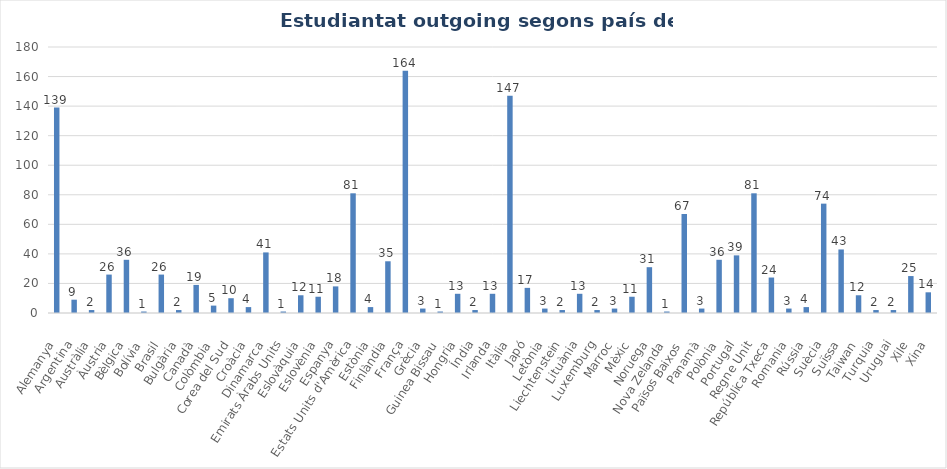
| Category | Total |
|---|---|
| Alemanya | 139 |
| Argentina | 9 |
| Austràlia | 2 |
| Àustria | 26 |
| Bèlgica | 36 |
| Bolívia | 1 |
| Brasil | 26 |
| Bulgària | 2 |
| Canadà | 19 |
| Colòmbia | 5 |
| Corea del Sud | 10 |
| Croàcia | 4 |
| Dinamarca | 41 |
| Emirats Àrabs Units | 1 |
| Eslovàquia | 12 |
| Eslovènia | 11 |
| Espanya | 18 |
| Estats Units d'Amèrica | 81 |
| Estònia | 4 |
| Finlàndia | 35 |
| França | 164 |
| Grècia | 3 |
| Guinea Bissau | 1 |
| Hongria | 13 |
| Índia | 2 |
| Irlanda | 13 |
| Itàlia | 147 |
| Japó | 17 |
| Letònia | 3 |
| Liechtenstein | 2 |
| Lituània | 13 |
| Luxemburg | 2 |
| Marroc | 3 |
| Mèxic | 11 |
| Noruega | 31 |
| Nova Zelanda | 1 |
| Països Baixos | 67 |
| Panamà | 3 |
| Polònia | 36 |
| Portugal | 39 |
| Regne Unit | 81 |
| República Txeca | 24 |
| Romania | 3 |
| Rússia | 4 |
| Suècia | 74 |
| Suïssa | 43 |
| Taiwan | 12 |
| Turquia | 2 |
| Uruguai | 2 |
| Xile | 25 |
| Xina | 14 |